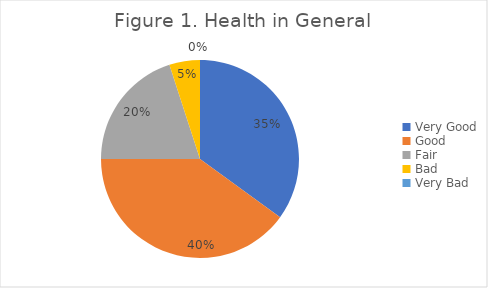
| Category | Series 0 |
|---|---|
| Very Good | 0.35 |
| Good | 0.4 |
| Fair | 0.2 |
| Bad | 0.05 |
| Very Bad | 0 |